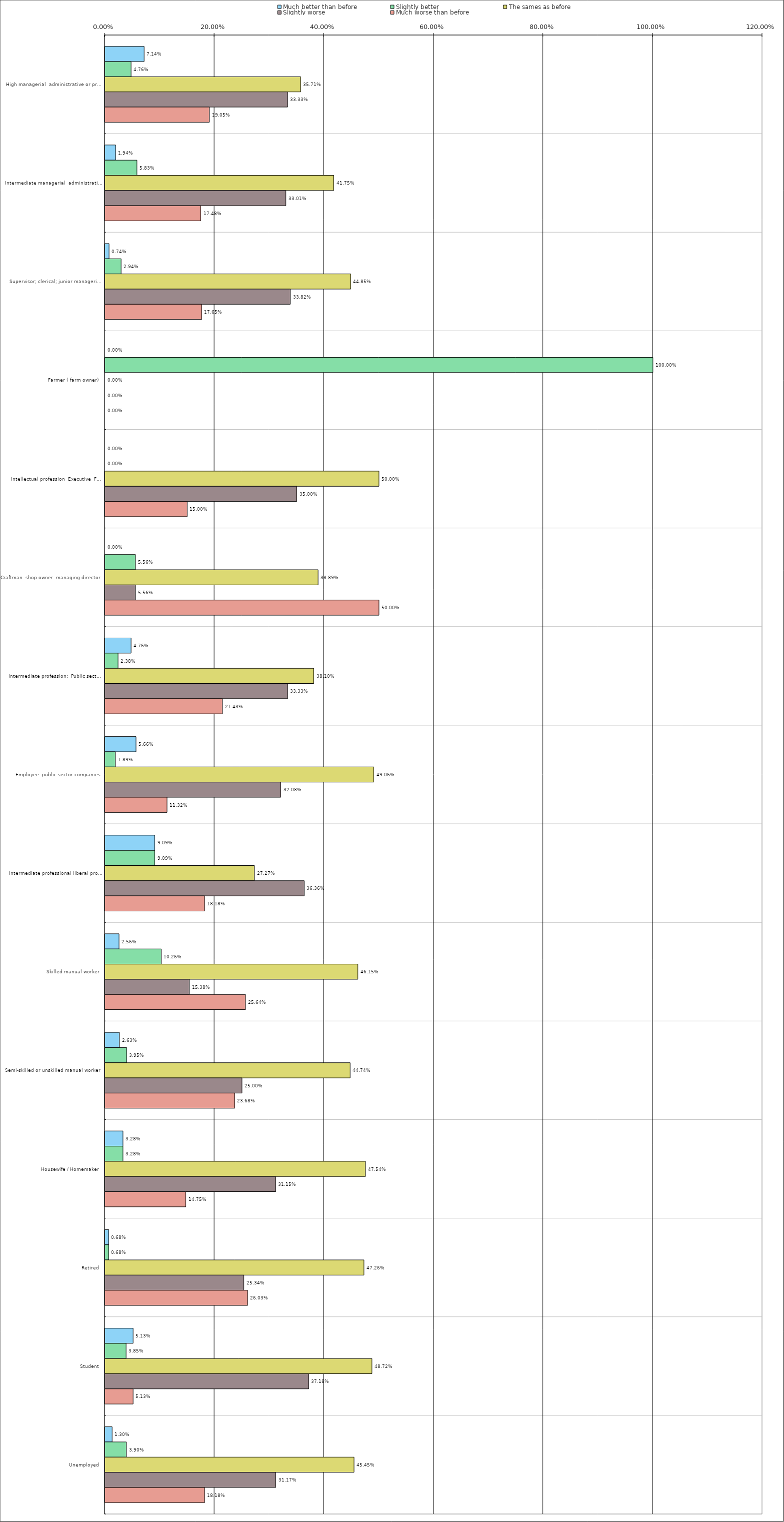
| Category | Much better than before | Slightly better | The sames as before | Slightly worse | Much worse than before |
|---|---|---|---|---|---|
| 0 | 0.071 | 0.048 | 0.357 | 0.333 | 0.19 |
| 1 | 0.019 | 0.058 | 0.418 | 0.33 | 0.175 |
| 2 | 0.007 | 0.029 | 0.448 | 0.338 | 0.176 |
| 3 | 0 | 1 | 0 | 0 | 0 |
| 4 | 0 | 0 | 0.5 | 0.35 | 0.15 |
| 5 | 0 | 0.056 | 0.389 | 0.056 | 0.5 |
| 6 | 0.048 | 0.024 | 0.381 | 0.333 | 0.214 |
| 7 | 0.057 | 0.019 | 0.491 | 0.321 | 0.113 |
| 8 | 0.091 | 0.091 | 0.273 | 0.364 | 0.182 |
| 9 | 0.026 | 0.103 | 0.462 | 0.154 | 0.256 |
| 10 | 0.026 | 0.04 | 0.447 | 0.25 | 0.237 |
| 11 | 0.033 | 0.033 | 0.475 | 0.312 | 0.148 |
| 12 | 0.007 | 0.007 | 0.473 | 0.253 | 0.26 |
| 13 | 0.051 | 0.038 | 0.487 | 0.372 | 0.051 |
| 14 | 0.013 | 0.039 | 0.454 | 0.312 | 0.182 |